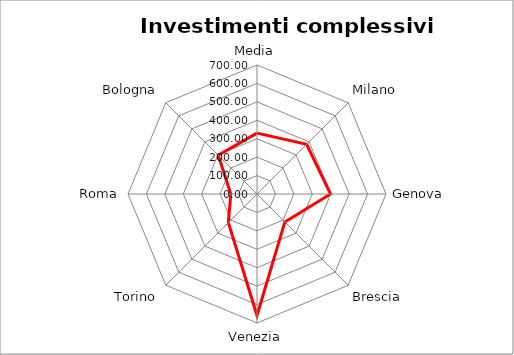
| Category | Investimenti complessivi procapite |
|---|---|
| Media | 330.331 |
| Milano | 380.7 |
| Genova | 399.19 |
| Brescia | 213.93 |
| Venezia | 659.1 |
| Torino | 219.83 |
| Roma | 142.21 |
| Bologna | 297.36 |